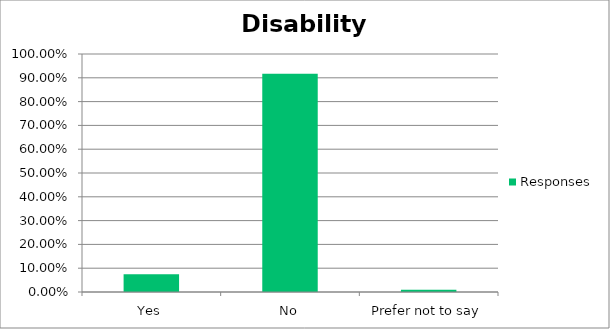
| Category | Responses |
|---|---|
| Yes | 0.074 |
| No | 0.917 |
| Prefer not to say | 0.009 |